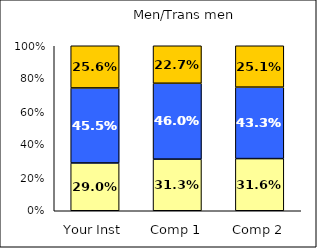
| Category | Low Science Identity | Average Science Identity | High Science Identity |
|---|---|---|---|
| Your Inst | 0.29 | 0.455 | 0.256 |
| Comp 1 | 0.313 | 0.46 | 0.227 |
| Comp 2 | 0.316 | 0.433 | 0.251 |